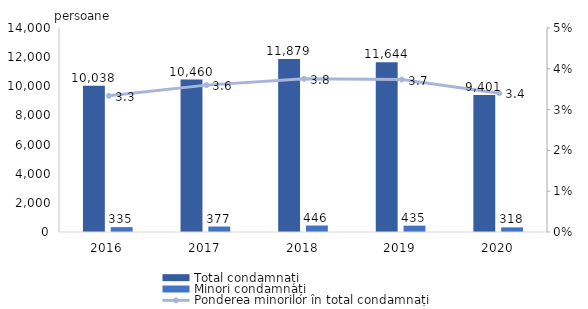
| Category | Total condamnați | Minori condamnați |
|---|---|---|
| 2016.0 | 10038 | 335 |
| 2017.0 | 10460 | 377 |
| 2018.0 | 11879 | 446 |
| 2019.0 | 11644 | 435 |
| 2020.0 | 9401 | 318 |